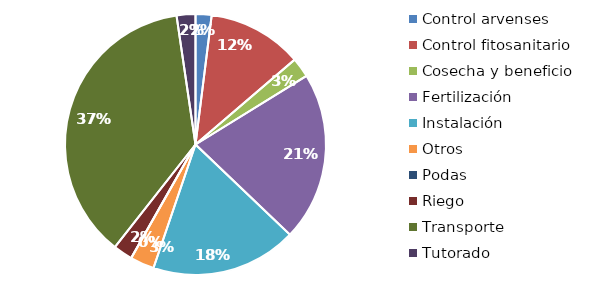
| Category | Valor |
|---|---|
| Control arvenses | 1902115 |
| Control fitosanitario | 11272086 |
| Cosecha y beneficio | 2349135.447 |
| Fertilización | 20107880 |
| Instalación | 17350148.127 |
| Otros | 2863720 |
| Podas | 0 |
| Riego | 2293204 |
| Transporte | 35570520 |
| Tutorado | 2237272 |